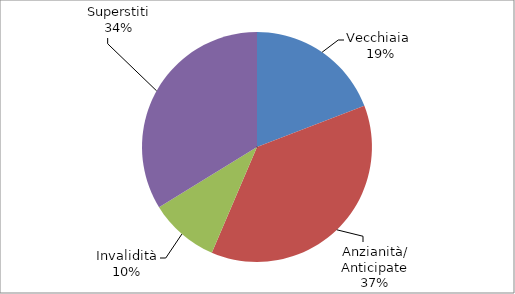
| Category | Series 0 |
|---|---|
| Vecchiaia  | 14140 |
| Anzianità/ Anticipate | 27499 |
| Invalidità | 7234 |
| Superstiti | 24919 |